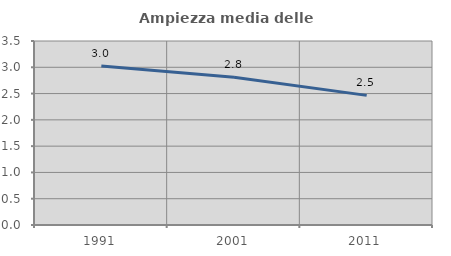
| Category | Ampiezza media delle famiglie |
|---|---|
| 1991.0 | 3.023 |
| 2001.0 | 2.808 |
| 2011.0 | 2.466 |